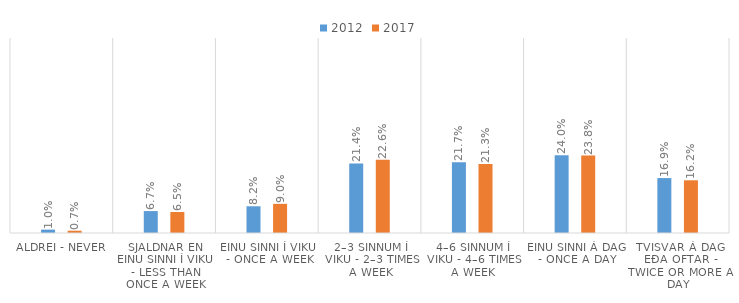
| Category | 2012 | 2017 |
|---|---|---|
| Aldrei - Never | 0.01 | 0.007 |
| Sjaldnar en einu sinni í viku - Less than once a week | 0.067 | 0.065 |
| Einu sinni í viku - Once a week | 0.082 | 0.09 |
| 2–3 sinnum í viku - 2–3 times a week | 0.214 | 0.226 |
| 4–6 sinnum í viku - 4–6 times a week | 0.217 | 0.213 |
| Einu sinni á dag - Once a day | 0.24 | 0.238 |
| Tvisvar á dag eða oftar - Twice or more a day | 0.169 | 0.162 |